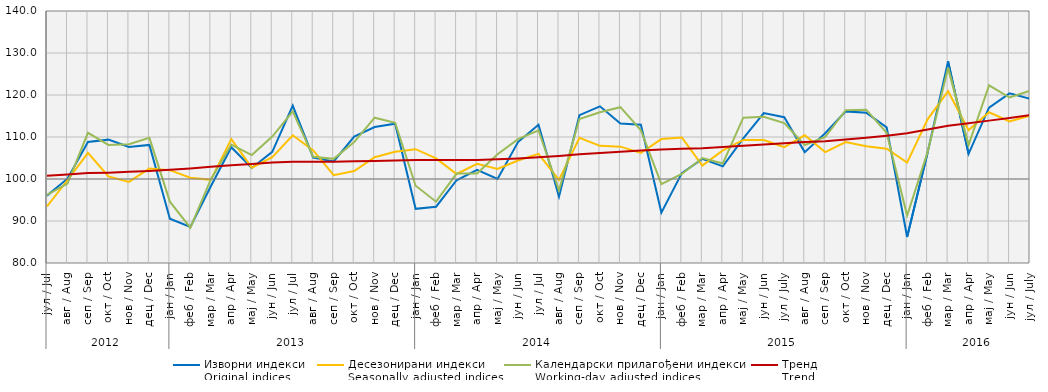
| Category | Изворни индекси
Original indices | Десезонирани индекси
Seasonally adjusted indices | Календарски прилагођени индекси
Working-day adjusted indices | Тренд
Trend |
|---|---|---|---|---|
| 0 | 96.046 | 93.5 | 96.2 | 100.8 |
| 1 | 100.071 | 99.7 | 98.9 | 101.1 |
| 2 | 108.809 | 106.2 | 111 | 101.4 |
| 3 | 109.371 | 100.6 | 108.1 | 101.5 |
| 4 | 107.609 | 99.3 | 108.3 | 101.7 |
| 5 | 108.112 | 102.5 | 109.8 | 101.9 |
| 6 | 90.559 | 102.1 | 94.6 | 102.2 |
| 7 | 88.596 | 100.3 | 88.4 | 102.5 |
| 8 | 98.288 | 99.8 | 99.9 | 102.9 |
| 9 | 107.567 | 109.5 | 108.2 | 103.3 |
| 10 | 102.635 | 102.7 | 105.7 | 103.6 |
| 11 | 106.478 | 105.2 | 110.1 | 103.9 |
| 12 | 117.488 | 110.4 | 116.1 | 104.1 |
| 13 | 105.073 | 106.8 | 105.3 | 104.1 |
| 14 | 104.198 | 100.9 | 104.8 | 104.1 |
| 15 | 110.096 | 101.9 | 108.8 | 104.2 |
| 16 | 112.368 | 105.2 | 114.6 | 104.3 |
| 17 | 113.169 | 106.5 | 113.4 | 104.4 |
| 18 | 92.9 | 107.1 | 98.4 | 104.5 |
| 19 | 93.4 | 104.9 | 94.6 | 104.5 |
| 20 | 99.7 | 101.2 | 101.3 | 104.5 |
| 21 | 102.2 | 103.6 | 101.3 | 104.5 |
| 22 | 100 | 102.4 | 105.9 | 104.7 |
| 23 | 108.8 | 104.4 | 109.5 | 104.9 |
| 24 | 112.9 | 106 | 111.6 | 105.2 |
| 25 | 95.8 | 99.8 | 97.3 | 105.5 |
| 26 | 115.2 | 109.8 | 114.3 | 105.9 |
| 27 | 117.3 | 107.9 | 115.9 | 106.2 |
| 28 | 113.2 | 107.7 | 117.1 | 106.5 |
| 29 | 112.9 | 106.2 | 111.6 | 106.8 |
| 30 | 92 | 109.5 | 98.8 | 107 |
| 31 | 101.4 | 109.9 | 101.2 | 107.2 |
| 32 | 104.8 | 103.2 | 105 | 107.3 |
| 33 | 103 | 106.8 | 103.7 | 107.6 |
| 34 | 109.651 | 109.3 | 114.6 | 107.9 |
| 35 | 115.698 | 109.3 | 114.8 | 108.2 |
| 36 | 114.7 | 107.6 | 113.3 | 108.5 |
| 37 | 106.4 | 110.4 | 108.1 | 108.8 |
| 38 | 110.9 | 106.4 | 110 | 109 |
| 39 | 116.1 | 108.8 | 116.4 | 109.4 |
| 40 | 115.8 | 107.8 | 116.5 | 109.8 |
| 41 | 112.3 | 107.2 | 111 | 110.3 |
| 42 | 86.2 | 103.9 | 91.3 | 110.9 |
| 43 | 106.3 | 114.2 | 106.4 | 111.8 |
| 44 | 128 | 120.9 | 126.5 | 112.7 |
| 45 | 106 | 111.6 | 108.1 | 113.3 |
| 46 | 117 | 115.9 | 122.3 | 113.9 |
| 47 | 120.4 | 113.7 | 119.4 | 114.5 |
| 48 | 119.1 | 115.1 | 121 | 115.2 |